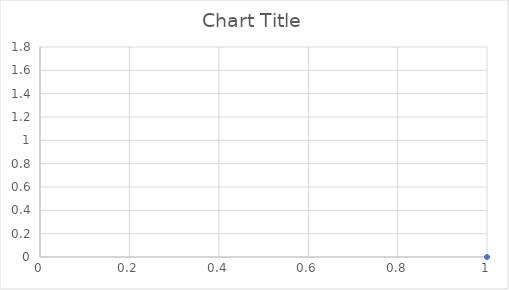
| Category | Series 0 |
|---|---|
| 0 | 0 |
| 1 | 0.165 |
| 2 | 0.316 |
| 3 | 0.466 |
| 4 | 0.619 |
| 5 | 0.768 |
| 6 | 0.983 |
| 7 | 1.144 |
| 8 | 1.3 |
| 9 | 1.457 |
| 10 | 1.6 |